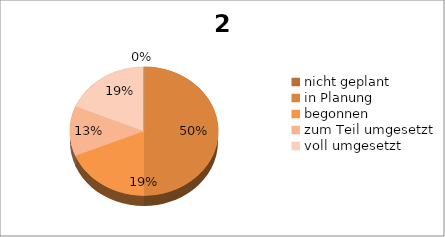
| Category | 2.1 Befragung |
|---|---|
| nicht geplant | 0 |
| in Planung | 8 |
| begonnen | 3 |
| zum Teil umgesetzt | 2 |
| voll umgesetzt | 3 |